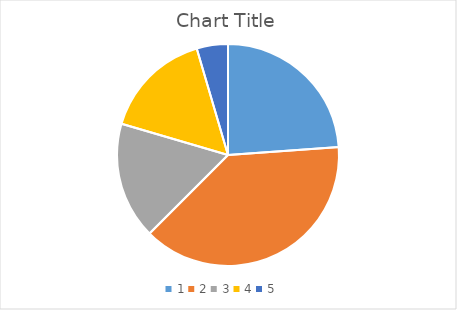
| Category | Series 0 |
|---|---|
| 0 | 23.864 |
| 1 | 38.636 |
| 2 | 17.045 |
| 3 | 15.909 |
| 4 | 4.545 |